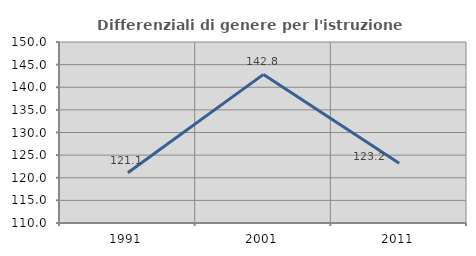
| Category | Differenziali di genere per l'istruzione superiore |
|---|---|
| 1991.0 | 121.087 |
| 2001.0 | 142.839 |
| 2011.0 | 123.18 |